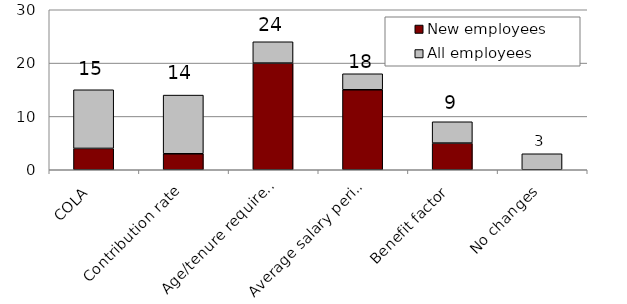
| Category | New employees | All employees |
|---|---|---|
| COLA | 4 | 11 |
| Contribution rate | 3 | 11 |
| Age/tenure requirements | 20 | 4 |
| Average salary period | 15 | 3 |
| Benefit factor | 5 | 4 |
| No changes | 0 | 3 |